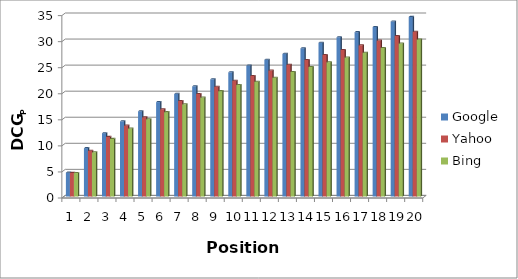
| Category | Google | Yahoo | Bing |
|---|---|---|---|
| 0 | 4.58 | 4.53 | 4.5 |
| 1 | 9.28 | 8.78 | 8.48 |
| 2 | 12.15 | 11.44 | 11.06 |
| 3 | 14.43 | 13.63 | 13.05 |
| 4 | 16.36 | 15.2 | 14.83 |
| 5 | 18.12 | 16.74 | 16.19 |
| 6 | 19.7 | 18.33 | 17.69 |
| 7 | 21.15 | 19.68 | 18.99 |
| 8 | 22.49 | 21.05 | 20.22 |
| 9 | 23.83 | 22.22 | 21.39 |
| 10 | 25.13 | 23.13 | 22.03 |
| 11 | 26.25 | 24.18 | 22.8 |
| 12 | 27.38 | 25.26 | 23.9 |
| 13 | 28.44 | 26.2 | 24.83 |
| 14 | 29.51 | 27.17 | 25.75 |
| 15 | 30.56 | 28.12 | 26.66 |
| 16 | 31.54 | 29.01 | 27.57 |
| 17 | 32.53 | 29.93 | 28.49 |
| 18 | 33.58 | 30.8 | 29.37 |
| 19 | 34.47 | 31.63 | 30.11 |